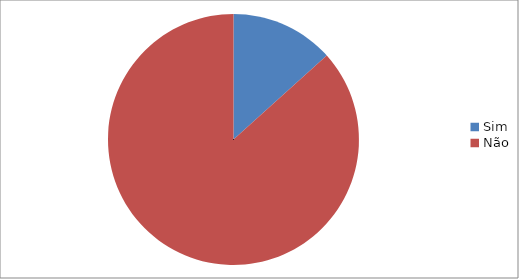
| Category | Series 0 |
|---|---|
| Sim | 22 |
| Não | 143 |